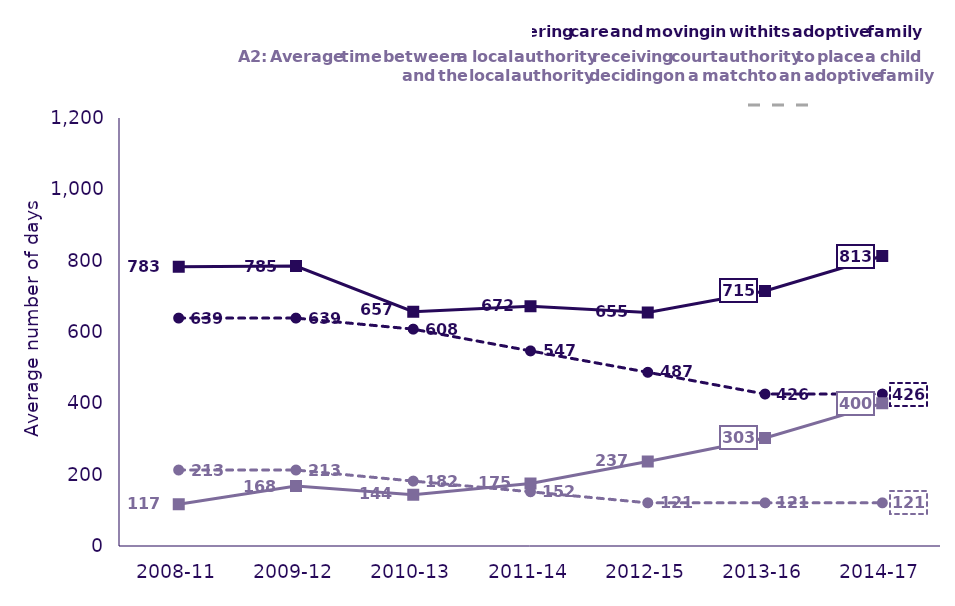
| Category | National threshold for average time from child entering care to moving in with its adoptive family | National threshold for average time from the LA receiving court authority to place a child and matching with adoptive family | Series 2 | Series 3 |
|---|---|---|---|---|
| 2008-11 | 639 | 213 | 783 | 117 |
| 2009-12 | 639 | 213 | 785 | 168 |
| 2010-13 | 608 | 182 | 657 | 144 |
| 2011-14 | 547 | 152 | 672 | 175 |
| 2012-15 | 487 | 121 | 655 | 237 |
| 2013-16 | 426 | 121 | 715 | 303 |
| 2014-17 | 426 | 121 | 813 | 400 |